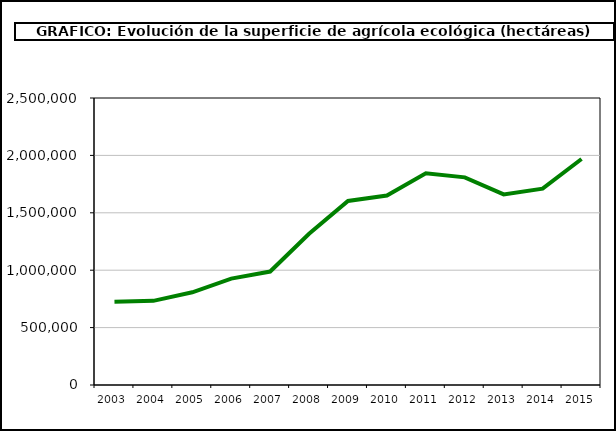
| Category | Superficie (ha) |
|---|---|
| 2003.0 | 725254 |
| 2004.0 | 733182 |
| 2005.0 | 807569 |
| 2006.0 | 926390 |
| 2007.0 | 988323 |
| 2008.0 | 1317752 |
| 2009.0 | 1602868 |
| 2010.0 | 1650866 |
| 2011.0 | 1845039 |
| 2012.0 | 1808492 |
| 2013.0 | 1659916 |
| 2014.0 | 1710493 |
| 2015.0 | 1968570 |